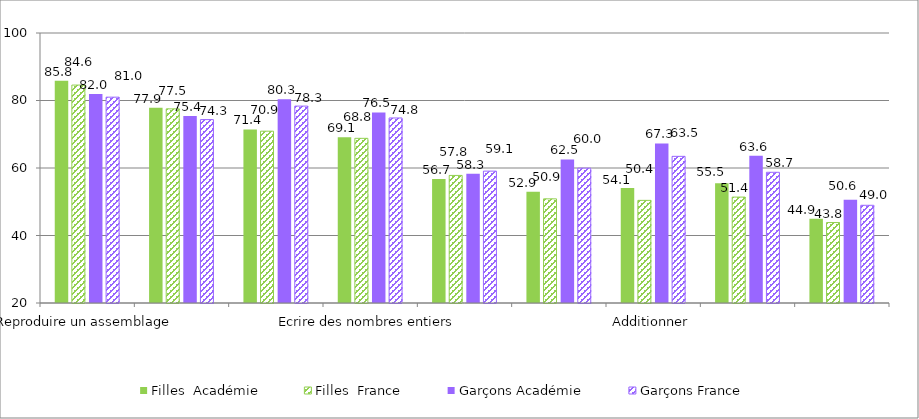
| Category | Filles  | Garçons |
|---|---|---|
| Reproduire un assemblage | 84.57 | 80.99 |
| Calculer mentalement | 77.52 | 74.34 |
| Lire des nombres entiers | 70.91 | 78.34 |
| Ecrire des nombres entiers | 68.79 | 74.82 |
| Représenter des nombres entiers | 57.8 | 59.07 |
| Associer un nombre entier à une position | 50.86 | 59.95 |
| Additionner | 50.41 | 63.45 |
| Soustraire | 51.38 | 58.73 |
| Résoudre des problèmes | 43.84 | 48.95 |